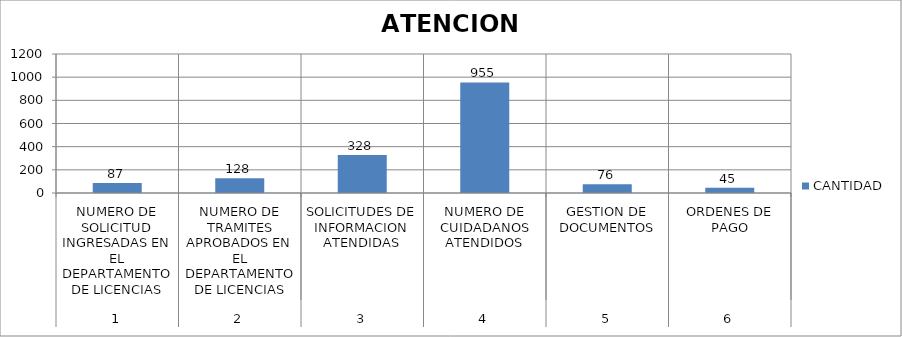
| Category | CANTIDAD |
|---|---|
| 0 | 87 |
| 1 | 128 |
| 2 | 328 |
| 3 | 955 |
| 4 | 76 |
| 5 | 45 |